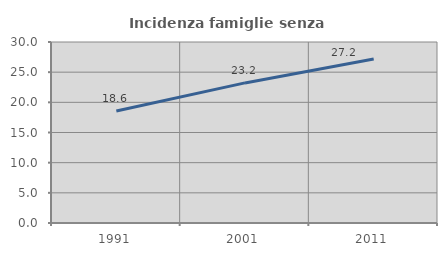
| Category | Incidenza famiglie senza nuclei |
|---|---|
| 1991.0 | 18.566 |
| 2001.0 | 23.22 |
| 2011.0 | 27.176 |